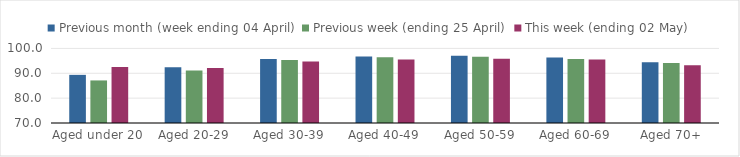
| Category | Previous month (week ending 04 April) | Previous week (ending 25 April) | This week (ending 02 May) |
|---|---|---|---|
| Aged under 20 | 89.37 | 87.126 | 92.573 |
| Aged 20-29 | 92.404 | 91.114 | 92.081 |
| Aged 30-39 | 95.735 | 95.33 | 94.747 |
| Aged 40-49 | 96.751 | 96.476 | 95.509 |
| Aged 50-59 | 97.074 | 96.668 | 95.841 |
| Aged 60-69 | 96.358 | 95.733 | 95.508 |
| Aged 70+ | 94.419 | 94.088 | 93.207 |